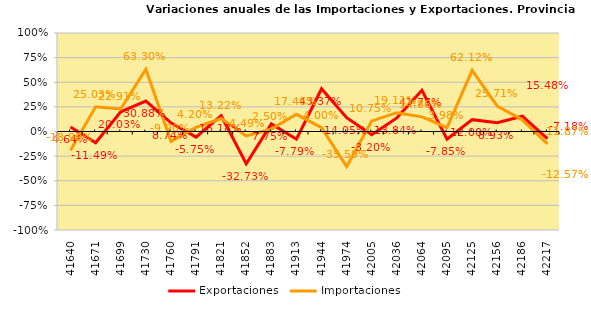
| Category | Exportaciones | Importaciones |
|---|---|---|
| 2014-01-01 | 0.046 | -0.19 |
| 2014-02-01 | -0.115 | 0.25 |
| 2014-03-01 | 0.2 | 0.229 |
| 2014-04-01 | 0.309 | 0.633 |
| 2014-05-01 | 0.087 | -0.099 |
| 2014-06-01 | -0.058 | 0.042 |
| 2014-07-01 | 0.162 | 0.132 |
| 2014-08-01 | -0.327 | -0.045 |
| 2014-09-01 | 0.078 | 0.025 |
| 2014-10-01 | -0.078 | 0.175 |
| 2014-11-01 | 0.434 | 0.04 |
| 2014-12-01 | 0.14 | -0.356 |
| 2015-01-01 | -0.032 | 0.107 |
| 2015-02-01 | 0.138 | 0.191 |
| 2015-03-01 | 0.418 | 0.149 |
| 2015-04-01 | -0.078 | 0.04 |
| 2015-05-01 | 0.12 | 0.621 |
| 2015-06-01 | 0.089 | 0.257 |
| 2015-07-01 | 0.155 | 0.119 |
| 2015-08-01 | -0.072 | -0.126 |